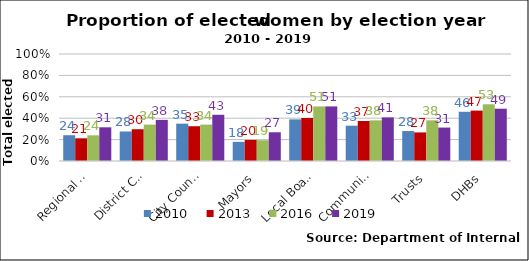
| Category | 2010 | 2013 | 2016 | 2019 |
|---|---|---|---|---|
| Regional Councils | 0.241 | 0.212 | 0.24 | 0.315 |
| District Councils | 0.276 | 0.297 | 0.34 | 0.384 |
| City Councils | 0.349 | 0.325 | 0.34 | 0.432 |
| Mayors | 0.179 | 0.197 | 0.194 | 0.269 |
| Local Boards | 0.389 | 0.402 | 0.51 | 0.51 |
| Community boards | 0.33 | 0.374 | 0.38 | 0.408 |
| Trusts | 0.28 | 0.267 | 0.38 | 0.312 |
| DHBs | 0.46 | 0.471 | 0.53 | 0.489 |